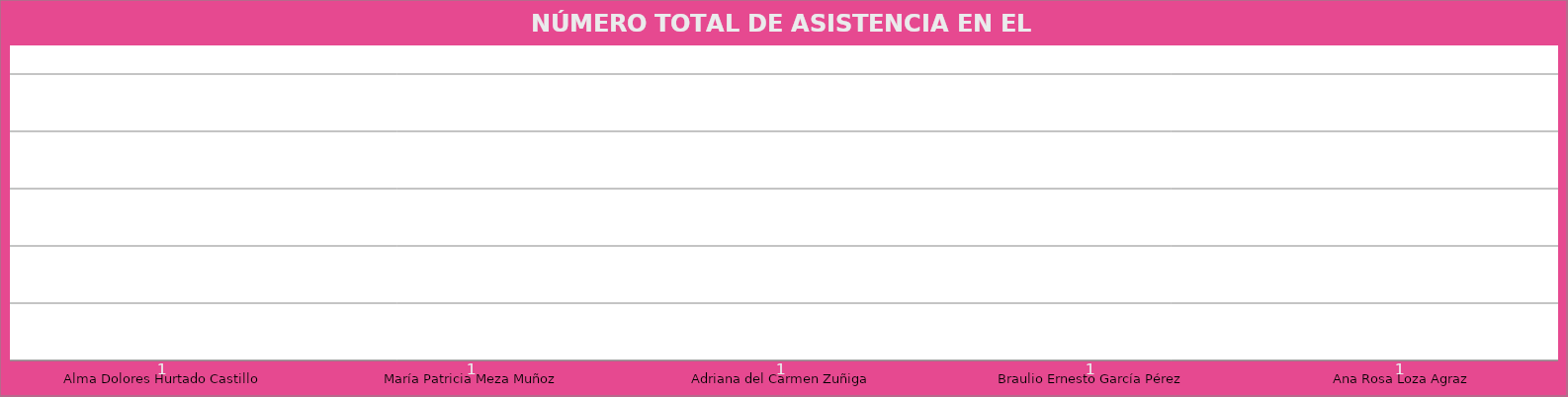
| Category | Alma Dolores Hurtado Castillo |
|---|---|
| Alma Dolores Hurtado Castillo | 1 |
| María Patricia Meza Muñoz | 1 |
| Adriana del Carmen Zuñiga | 1 |
| Braulio Ernesto García Pérez | 1 |
| Ana Rosa Loza Agraz | 1 |